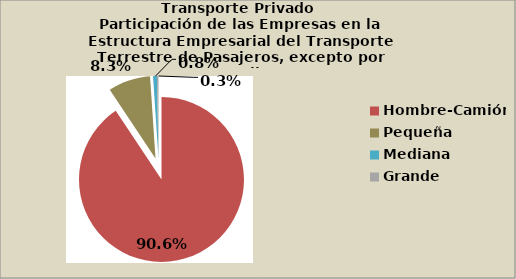
| Category | Series 0 |
|---|---|
| Hombre-Camión | 90.649 |
| Pequeña | 8.296 |
| Mediana | 0.754 |
| Grande | 0.302 |